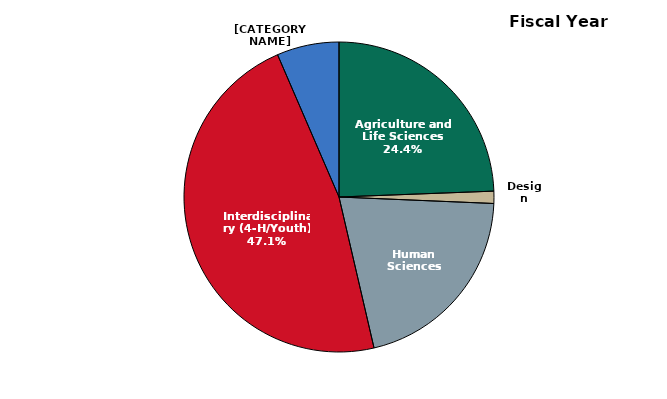
| Category | 2021-2022 |
|---|---|
| Agriculture and Life Sciences | 215241 |
| Design | 11224 |
| Human Sciences | 182633 |
| Interdisciplinary (4-H/Youth) | 415918 |
| Interdisciplinary (County Delivered) | 57249 |